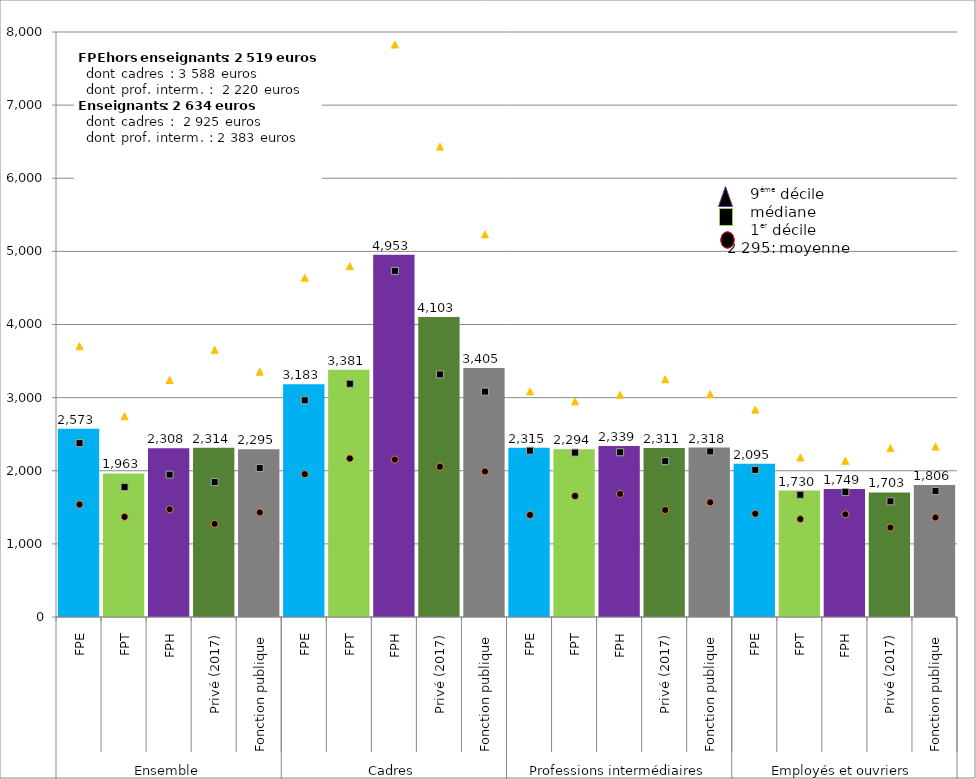
| Category | Moy |
|---|---|
| 0 | 2572.71 |
| 1 | 1962.78 |
| 2 | 2307.8 |
| 3 | 2314 |
| 4 | 2295.15 |
| 5 | 3182.88 |
| 6 | 3381.34 |
| 7 | 4953.47 |
| 8 | 4103 |
| 9 | 3405.4 |
| 10 | 2314.81 |
| 11 | 2294.49 |
| 12 | 2339.22 |
| 13 | 2311 |
| 14 | 2317.69 |
| 15 | 2095.49 |
| 16 | 1729.77 |
| 17 | 1748.8 |
| 18 | 1703 |
| 19 | 1806.15 |